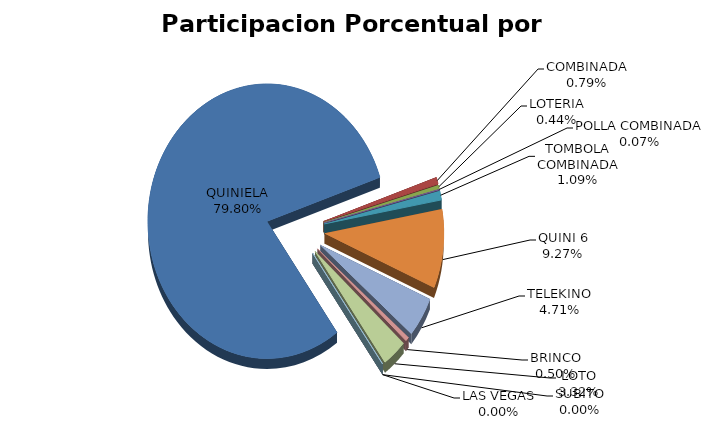
| Category | Series 0 |
|---|---|
| QUINIELA | 17568505.56 |
| COMBINADA | 174070.05 |
| LOTERIA | 97912.28 |
| POLLA COMBINADA | 15362.58 |
| TOMBOLA COMBINADA | 239670 |
| QUINI 6 | 2040230.414 |
| TELEKINO | 1037068.5 |
| BRINCO | 109991.31 |
| LOTO | 731837.411 |
| SUBITO | 0 |
| LAS VEGAS | 0 |